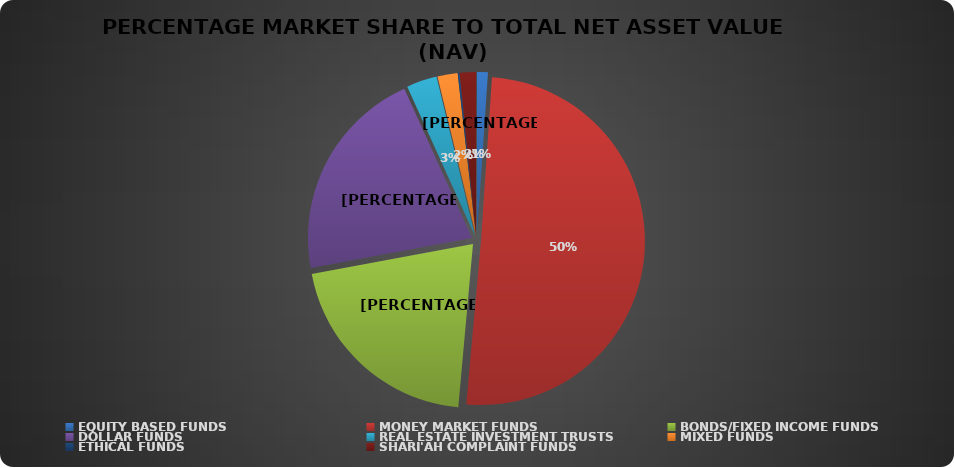
| Category | NET ASSET VALUE |
|---|---|
| EQUITY BASED FUNDS | 16794813036.27 |
| MONEY MARKET FUNDS | 792540018978.43 |
| BONDS/FIXED INCOME FUNDS | 324966477016.163 |
| DOLLAR FUNDS | 332681726568.126 |
| REAL ESTATE INVESTMENT TRUSTS | 47216549017.91 |
| MIXED FUNDS | 31321324637.973 |
| ETHICAL FUNDS | 3019546321.44 |
| SHARI'AH COMPLAINT FUNDS | 25078820531.75 |